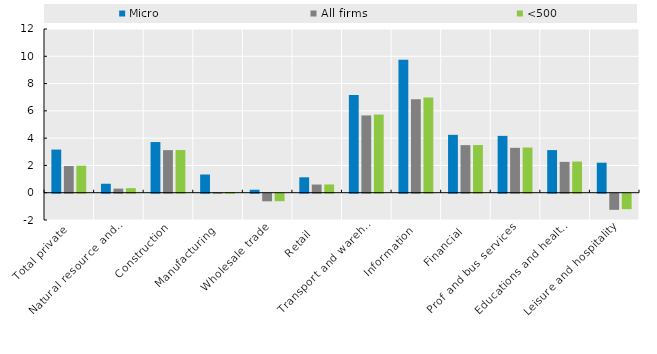
| Category | Micro | All firms | <500 |
|---|---|---|---|
| Total private | 3.162 | 1.961 | 1.983 |
| Natural resource and mining | 0.657 | 0.301 | 0.335 |
| Construction | 3.713 | 3.121 | 3.129 |
| Manufacturing | 1.334 | 0.022 | 0.054 |
| Wholesale trade | 0.219 | -0.558 | -0.55 |
| Retail  | 1.129 | 0.599 | 0.606 |
| Transport and warehousing | 7.168 | 5.665 | 5.728 |
| Information | 9.738 | 6.849 | 6.972 |
| Financial | 4.243 | 3.489 | 3.495 |
| Prof and bus services | 4.166 | 3.291 | 3.312 |
| Educations and health services | 3.124 | 2.261 | 2.286 |
| Leisure and hospitality | 2.202 | -1.181 | -1.133 |